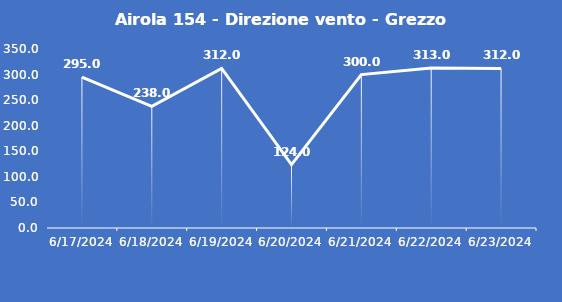
| Category | Airola 154 - Direzione vento - Grezzo (°N) |
|---|---|
| 6/17/24 | 295 |
| 6/18/24 | 238 |
| 6/19/24 | 312 |
| 6/20/24 | 124 |
| 6/21/24 | 300 |
| 6/22/24 | 313 |
| 6/23/24 | 312 |